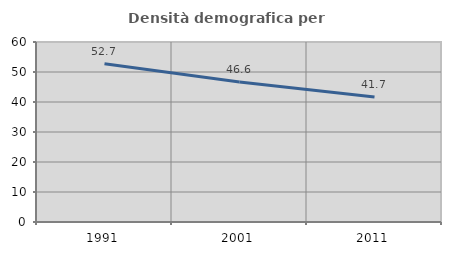
| Category | Densità demografica |
|---|---|
| 1991.0 | 52.714 |
| 2001.0 | 46.632 |
| 2011.0 | 41.687 |